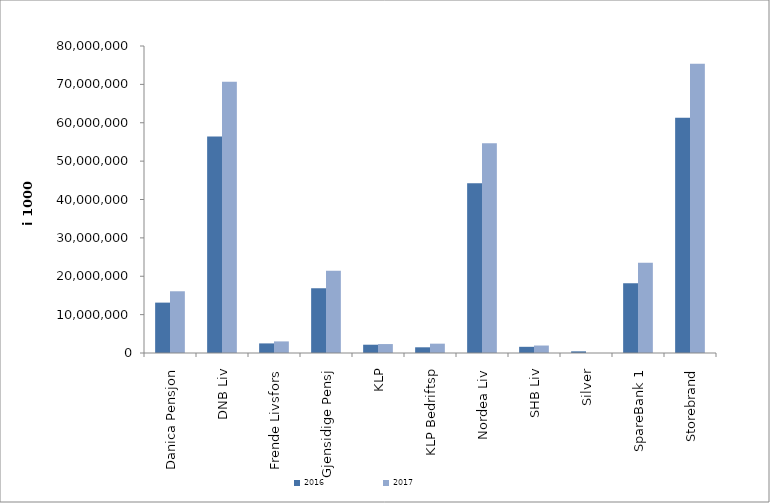
| Category | 2016 | 2017 |
|---|---|---|
| 0 | 13128957.816 | 16087298.015 |
| 1 | 56416731 | 70689761 |
| 2 | 2500425 | 3022527.8 |
| 3 | 16856721.399 | 21451220.49 |
| 4 | 2160404.796 | 2330198.916 |
| 5 | 1486637 | 2432471 |
| 6 | 44252990 | 54647570 |
| 7 | 1612357 | 1949500 |
| 8 | 432248.263 | 0 |
| 9 | 18158905.377 | 23504999.904 |
| 10 | 61277517.591 | 75354538.838 |